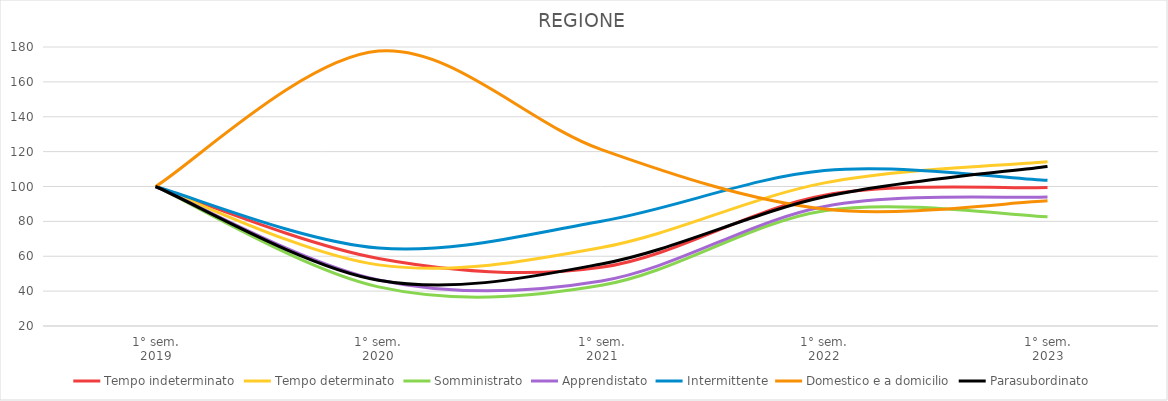
| Category | Tempo indeterminato | Tempo determinato | Somministrato | Apprendistato | Intermittente | Domestico e a domicilio | Parasubordinato |
|---|---|---|---|---|---|---|---|
| 1° sem.
2019 | 100 | 100 | 100 | 100 | 100 | 100 | 100 |
| 1° sem.
2020 | 58.727 | 55.05 | 42.436 | 46.384 | 64.731 | 177.647 | 46.284 |
| 1° sem.
2021 | 53.636 | 64.969 | 43.333 | 45.836 | 80.091 | 121.176 | 55.597 |
| 1° sem.
2022 | 95.023 | 102.09 | 86.087 | 88.548 | 109.112 | 87.059 | 94.08 |
| 1° sem.
2023 | 99.386 | 114.138 | 82.659 | 93.945 | 103.533 | 91.765 | 111.502 |